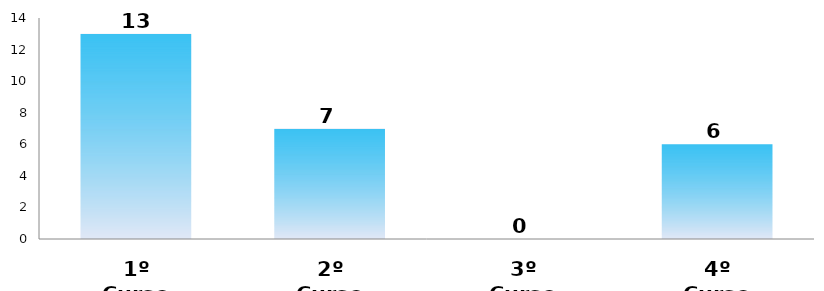
| Category | Series 0 |
|---|---|
| 1º Curso | 13 |
| 2º Curso | 7 |
| 3º Curso | 0 |
| 4º Curso | 6 |